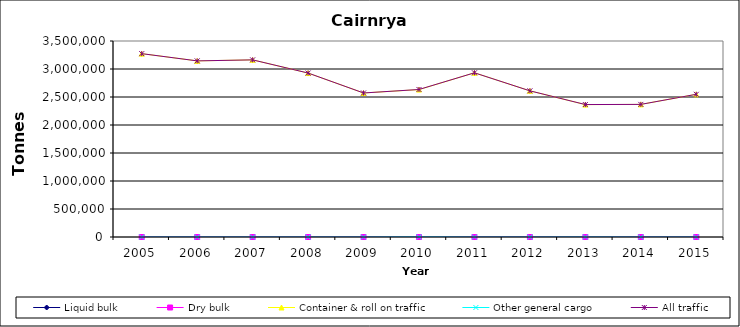
| Category | Liquid bulk | Dry bulk | Container & roll on traffic | Other general cargo | All traffic |
|---|---|---|---|---|---|
| 2005.0 | 0 | 0 | 3274000 | 0 | 3274000 |
| 2006.0 | 0 | 0 | 3145000 | 0 | 3145000 |
| 2007.0 | 0 | 0 | 3163000 | 0 | 3163000 |
| 2008.0 | 0 | 0 | 2928000 | 0 | 2928000 |
| 2009.0 | 0 | 0 | 2571913 | 0 | 2571913 |
| 2010.0 | 0 | 0 | 2632000 | 3000 | 2634000 |
| 2011.0 | 0 | 0 | 2932000 | 0 | 2932000 |
| 2012.0 | 0 | 0 | 2610000 | 0 | 2610000 |
| 2013.0 | 0 | 0 | 2364000 | 1000 | 2365000 |
| 2014.0 | 0 | 0 | 2368000 | 0 | 2368000 |
| 2015.0 | 0 | 0 | 2548000 | 0 | 2548000 |